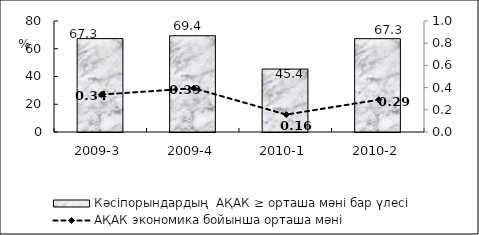
| Category | Кәсіпорындардың  АҚАК ≥ орташа мәні бар үлесі  |
|---|---|
| 2009-3 | 67.31 |
| 2009-4 | 69.37 |
| 2010-1 | 45.35 |
| 2010-2 | 67.27 |